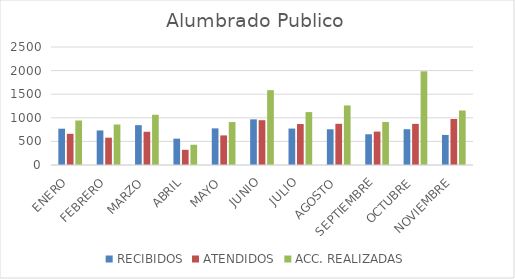
| Category | RECIBIDOS | ATENDIDOS | ACC. REALIZADAS |
|---|---|---|---|
| ENERO | 769 | 661 | 943 |
| FEBRERO | 732 | 579 | 858 |
| MARZO | 844 | 704 | 1064 |
| ABRIL | 558 | 322 | 429 |
| MAYO | 776 | 627 | 910 |
| JUNIO | 967 | 949 | 1586 |
| JULIO | 772 | 868 | 1121 |
| AGOSTO | 757 | 873 | 1262 |
| SEPTIEMBRE | 651 | 708 | 912 |
| OCTUBRE | 758 | 871 | 1985 |
| NOVIEMBRE | 637 | 974 | 1155 |